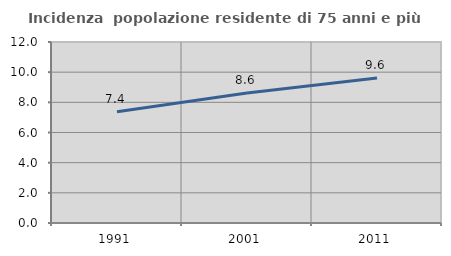
| Category | Incidenza  popolazione residente di 75 anni e più |
|---|---|
| 1991.0 | 7.381 |
| 2001.0 | 8.618 |
| 2011.0 | 9.616 |